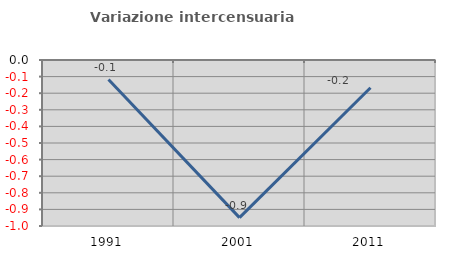
| Category | Variazione intercensuaria annua |
|---|---|
| 1991.0 | -0.118 |
| 2001.0 | -0.95 |
| 2011.0 | -0.168 |